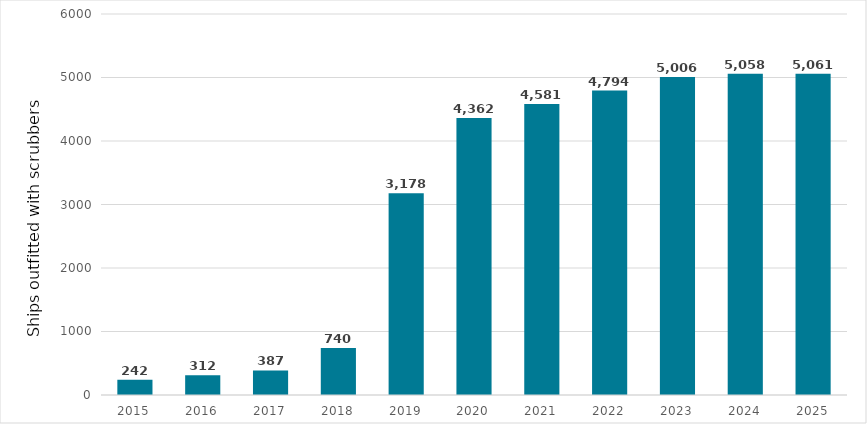
| Category | Total ships with scrubbers |
|---|---|
| 2015.0 | 242 |
| 2016.0 | 312 |
| 2017.0 | 387 |
| 2018.0 | 740 |
| 2019.0 | 3178 |
| 2020.0 | 4362 |
| 2021.0 | 4581 |
| 2022.0 | 4794 |
| 2023.0 | 5006 |
| 2024.0 | 5058 |
| 2025.0 | 5061 |